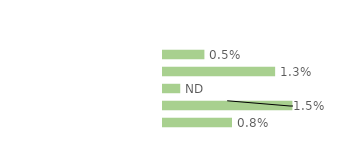
| Category | Series 0 |
|---|---|
| Personnes en emploi¹ | 0.005 |
| Chômeuses | 0.013 |
| Retraitées | 0.002 |
| Étudiantes, élèves | 0.015 |
| Autres inactifs  | 0.008 |